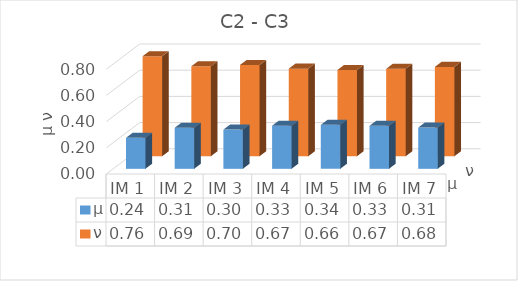
| Category | μ | ν |
|---|---|---|
| IM 1 | 0.236 | 0.764 |
| IM 2 | 0.313 | 0.687 |
| IM 3 | 0.299 | 0.697 |
| IM 4 | 0.329 | 0.669 |
| IM 5 | 0.336 | 0.659 |
| IM 6 | 0.329 | 0.667 |
| IM 7 | 0.315 | 0.682 |